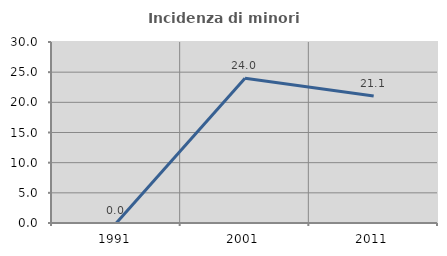
| Category | Incidenza di minori stranieri |
|---|---|
| 1991.0 | 0 |
| 2001.0 | 24 |
| 2011.0 | 21.053 |